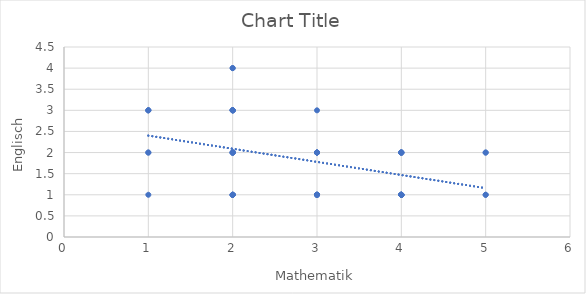
| Category | Series 0 |
|---|---|
| 1.0 | 1 |
| 1.0 | 2 |
| 1.0 | 2 |
| 1.0 | 3 |
| 1.0 | 3 |
| 1.0 | 3 |
| 2.0 | 1 |
| 2.0 | 1 |
| 2.0 | 1 |
| 2.0 | 1 |
| 2.0 | 1 |
| 2.0 | 2 |
| 2.0 | 2 |
| 2.0 | 2 |
| 2.0 | 2 |
| 2.0 | 2 |
| 2.0 | 3 |
| 2.0 | 3 |
| 2.0 | 3 |
| 2.0 | 3 |
| 2.0 | 3 |
| 2.0 | 4 |
| 2.0 | 4 |
| 3.0 | 1 |
| 3.0 | 1 |
| 3.0 | 1 |
| 3.0 | 1 |
| 3.0 | 1 |
| 3.0 | 1 |
| 3.0 | 2 |
| 3.0 | 2 |
| 3.0 | 2 |
| 3.0 | 2 |
| 3.0 | 2 |
| 3.0 | 3 |
| 4.0 | 1 |
| 4.0 | 1 |
| 4.0 | 1 |
| 4.0 | 1 |
| 4.0 | 1 |
| 4.0 | 1 |
| 4.0 | 1 |
| 4.0 | 1 |
| 4.0 | 2 |
| 4.0 | 2 |
| 4.0 | 2 |
| 4.0 | 2 |
| 4.0 | 2 |
| 5.0 | 1 |
| 5.0 | 1 |
| 5.0 | 2 |
| 5.0 | 2 |